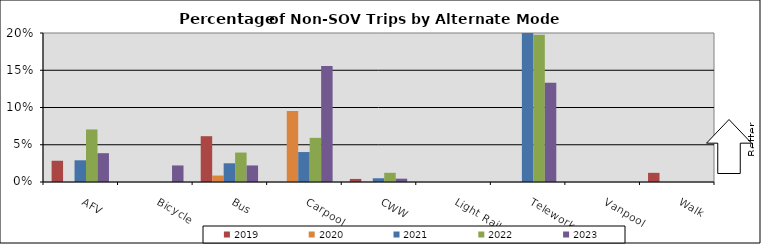
| Category | 2019 | 2020 | 2021 | 2022 | 2023 |
|---|---|---|---|---|---|
| AFV | 0.029 | 0 | 0.029 | 0.071 | 0.039 |
| Bicycle | 0 | 0 | 0 | 0 | 0.022 |
| Bus | 0.061 | 0.009 | 0.025 | 0.04 | 0.022 |
| Carpool | 0 | 0.095 | 0.04 | 0.059 | 0.156 |
| CWW | 0.004 | 0 | 0.005 | 0.012 | 0.004 |
| Light Rail | 0 | 0 | 0 | 0 | 0 |
| Telework | 0 | 0 | 0.261 | 0.198 | 0.133 |
| Vanpool | 0 | 0 | 0 | 0 | 0 |
| Walk | 0.012 | 0 | 0 | 0 | 0 |